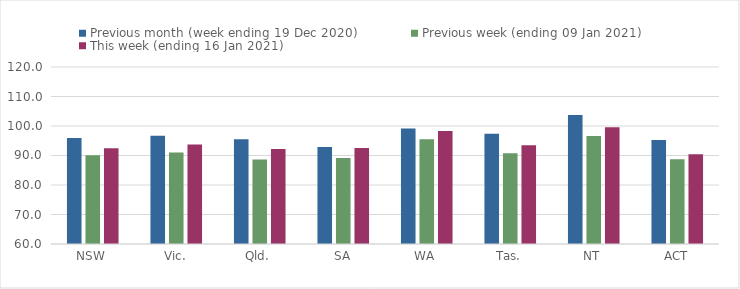
| Category | Previous month (week ending 19 Dec 2020) | Previous week (ending 09 Jan 2021) | This week (ending 16 Jan 2021) |
|---|---|---|---|
| NSW | 95.95 | 90.09 | 92.44 |
| Vic. | 96.71 | 91.03 | 93.7 |
| Qld. | 95.53 | 88.65 | 92.19 |
| SA | 92.9 | 89.14 | 92.57 |
| WA | 99.16 | 95.53 | 98.31 |
| Tas. | 97.4 | 90.8 | 93.48 |
| NT | 103.77 | 96.65 | 99.58 |
| ACT | 95.23 | 88.77 | 90.45 |